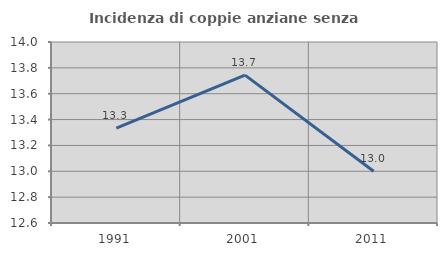
| Category | Incidenza di coppie anziane senza figli  |
|---|---|
| 1991.0 | 13.333 |
| 2001.0 | 13.744 |
| 2011.0 | 13 |